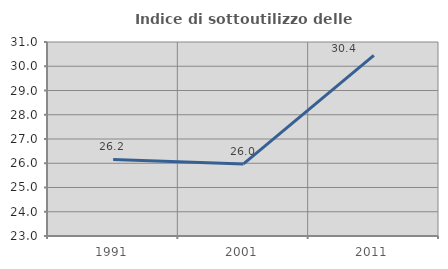
| Category | Indice di sottoutilizzo delle abitazioni  |
|---|---|
| 1991.0 | 26.157 |
| 2001.0 | 25.974 |
| 2011.0 | 30.449 |